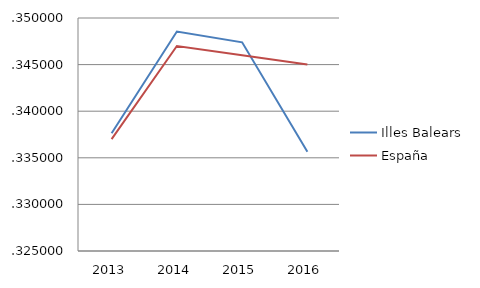
| Category | Illes Balears | España |
|---|---|---|
| 2013.0 | 0.338 | 0.337 |
| 2014.0 | 0.349 | 0.347 |
| 2015.0 | 0.347 | 0.346 |
| 2016.0 | 0.336 | 0.345 |